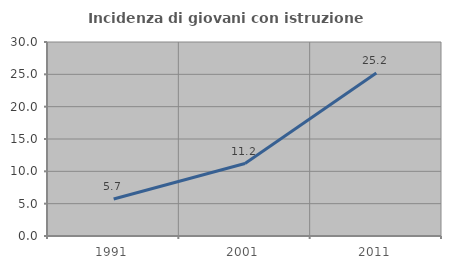
| Category | Incidenza di giovani con istruzione universitaria |
|---|---|
| 1991.0 | 5.714 |
| 2001.0 | 11.207 |
| 2011.0 | 25.191 |